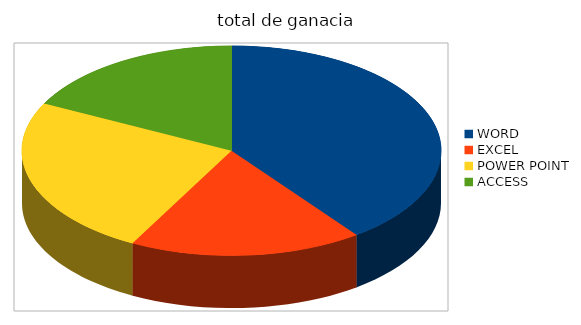
| Category | Series 0 |
|---|---|
| WORD | 3570 |
| EXCEL | 1610 |
| POWER POINT | 2205 |
| ACCESS | 1575 |